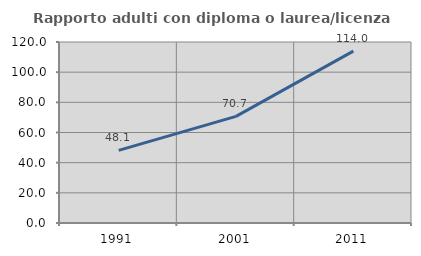
| Category | Rapporto adulti con diploma o laurea/licenza media  |
|---|---|
| 1991.0 | 48.148 |
| 2001.0 | 70.677 |
| 2011.0 | 113.953 |